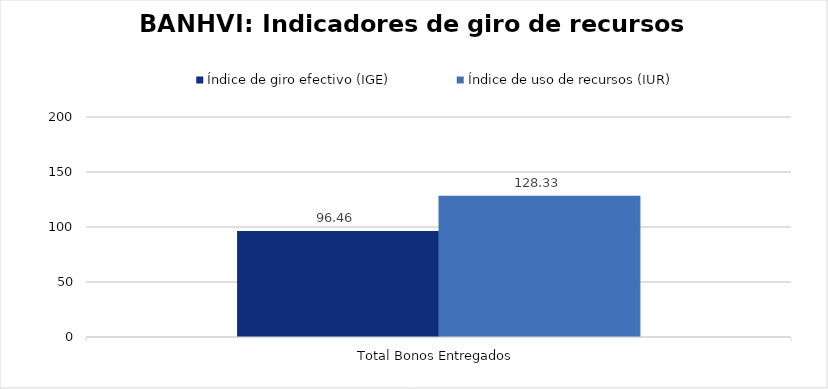
| Category | Índice de giro efectivo (IGE) | Índice de uso de recursos (IUR)  |
|---|---|---|
| Total Bonos Entregados | 96.459 | 128.326 |